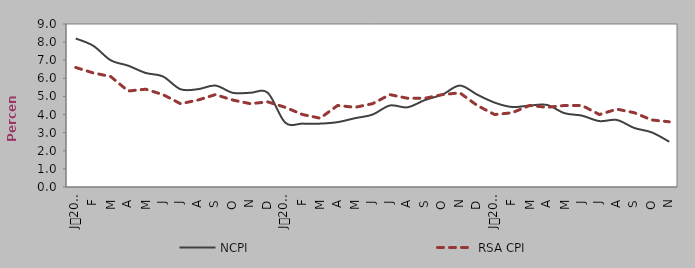
| Category | NCPI | RSA CPI |
|---|---|---|
| 0 | 8.2 | 6.6 |
| 1900-01-01 | 7.8 | 6.3 |
| 1900-01-02 | 7 | 6.1 |
| 1900-01-03 | 6.7 | 5.3 |
| 1900-01-04 | 6.3 | 5.4 |
| 1900-01-05 | 6.1 | 5.1 |
| 1900-01-06 | 5.4 | 4.6 |
| 1900-01-07 | 5.4 | 4.8 |
| 1900-01-08 | 5.6 | 5.1 |
| 1900-01-09 | 5.2 | 4.8 |
| 1900-01-10 | 5.2 | 4.6 |
| 1900-01-11 | 5.2 | 4.7 |
| 1900-01-12 | 3.555 | 4.4 |
| 1900-01-13 | 3.5 | 4 |
| 1900-01-14 | 3.5 | 3.8 |
| 1900-01-15 | 3.581 | 4.5 |
| 1900-01-16 | 3.8 | 4.4 |
| 1900-01-17 | 4 | 4.6 |
| 1900-01-18 | 4.5 | 5.1 |
| 1900-01-19 | 4.4 | 4.9 |
| 1900-01-20 | 4.8 | 4.9 |
| 1900-01-21 | 5.1 | 5.1 |
| 1900-01-22 | 5.6 | 5.2 |
| 1900-01-23 | 5.1 | 4.5 |
| 1900-01-24 | 4.658 | 4 |
| 1900-01-25 | 4.416 | 4.1 |
| 1900-01-26 | 4.498 | 4.5 |
| 1900-01-27 | 4.529 | 4.4 |
| 1900-01-28 | 4.076 | 4.5 |
| 1900-01-29 | 3.939 | 4.5 |
| 1900-01-30 | 3.639 | 4 |
| 1900-01-31 | 3.7 | 4.3 |
| 1900-02-01 | 3.259 | 4.1 |
| 1900-02-02 | 3.015 | 3.7 |
| 1900-02-03 | 2.5 | 3.6 |